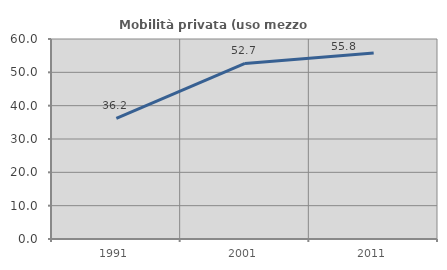
| Category | Mobilità privata (uso mezzo privato) |
|---|---|
| 1991.0 | 36.167 |
| 2001.0 | 52.655 |
| 2011.0 | 55.773 |